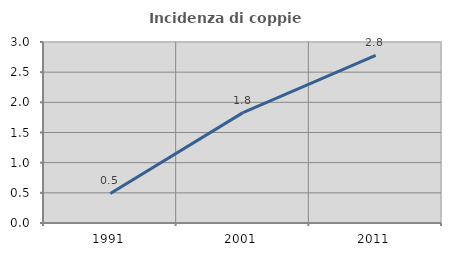
| Category | Incidenza di coppie miste |
|---|---|
| 1991.0 | 0.49 |
| 2001.0 | 1.829 |
| 2011.0 | 2.778 |